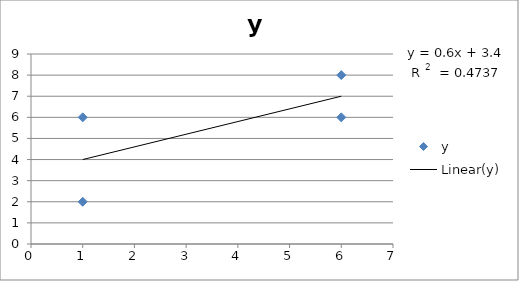
| Category | y |
|---|---|
| 1.0 | 2 |
| 1.0 | 6 |
| 6.0 | 6 |
| 6.0 | 8 |